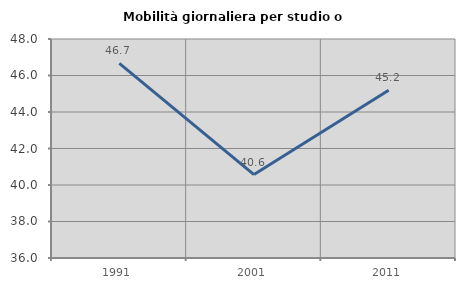
| Category | Mobilità giornaliera per studio o lavoro |
|---|---|
| 1991.0 | 46.667 |
| 2001.0 | 40.573 |
| 2011.0 | 45.196 |